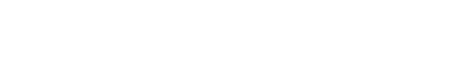
| Category | oui | non |
|---|---|---|
| 0.0 | 0 | 0 |